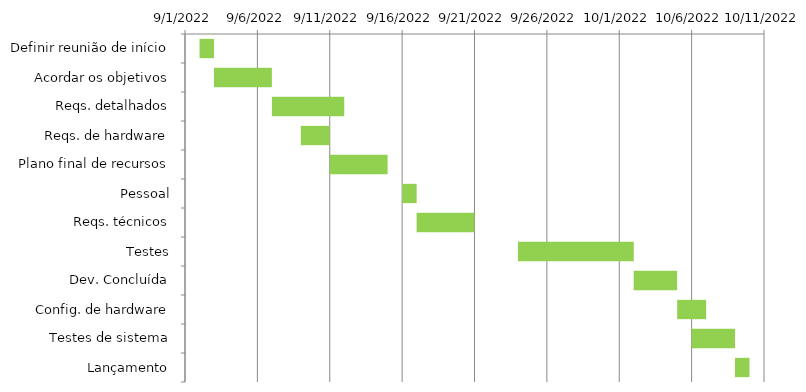
| Category | Início | Dias |
|---|---|---|
| Definir reunião de início | 9/2/22 | 1 |
| Acordar os objetivos | 9/3/22 | 4 |
| Reqs. detalhados | 9/7/22 | 5 |
| Reqs. de hardware | 9/9/22 | 2 |
| Plano final de recursos | 9/11/22 | 4 |
| Pessoal | 9/16/22 | 1 |
| Reqs. técnicos | 9/17/22 | 4 |
| Testes | 9/24/22 | 8 |
| Dev. Concluída | 10/2/22 | 3 |
| Config. de hardware | 10/5/22 | 2 |
| Testes de sistema | 10/6/22 | 3 |
| Lançamento | 10/9/22 | 1 |